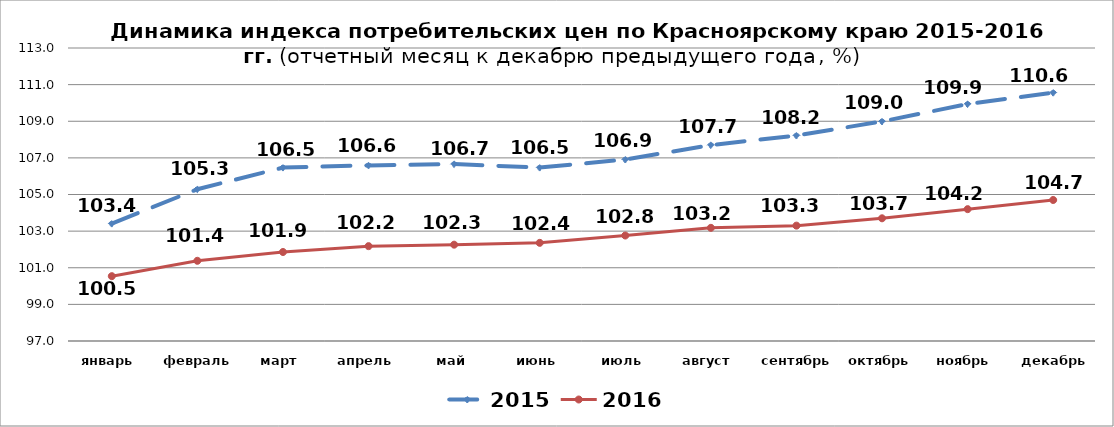
| Category | 2015 | 2016 |
|---|---|---|
| январь | 103.41 | 100.54 |
| февраль | 105.29 | 101.38 |
| март | 106.47 | 101.86 |
| апрель | 106.59 | 102.18 |
| май | 106.66 | 102.26 |
| июнь | 106.47 | 102.36 |
| июль | 106.91 | 102.76 |
| август | 107.7 | 103.18 |
| сентябрь | 108.22 | 103.3 |
| октябрь | 108.99 | 103.7 |
| ноябрь | 109.94 | 104.2 |
| декабрь | 110.56 | 104.7 |